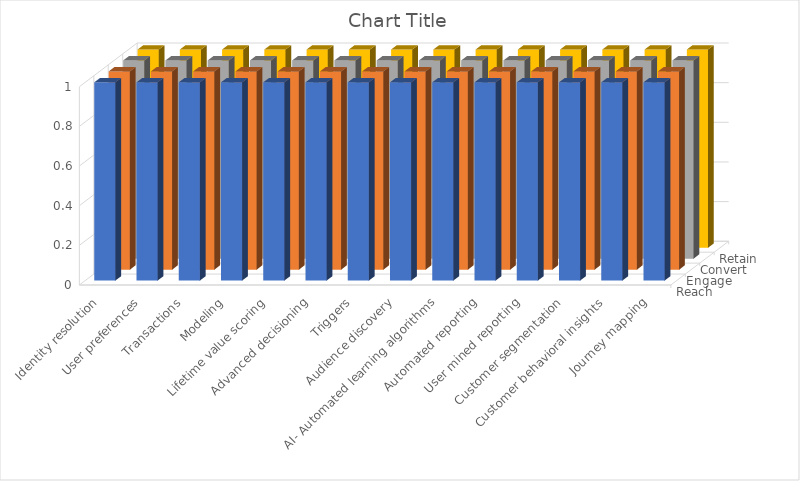
| Category | Reach | Engage | Convert | Retain |
|---|---|---|---|---|
| Identity resolution | 1 | 1 | 1 | 1 |
| User preferences | 1 | 1 | 1 | 1 |
| Transactions | 1 | 1 | 1 | 1 |
| Modeling | 1 | 1 | 1 | 1 |
| Lifetime value scoring | 1 | 1 | 1 | 1 |
| Advanced decisioning | 1 | 1 | 1 | 1 |
| Triggers | 1 | 1 | 1 | 1 |
| Audience discovery | 1 | 1 | 1 | 1 |
| AI- Automated learning algorithms | 1 | 1 | 1 | 1 |
| Automated reporting | 1 | 1 | 1 | 1 |
| User mined reporting | 1 | 1 | 1 | 1 |
| Customer segmentation | 1 | 1 | 1 | 1 |
| Customer behavioral insights | 1 | 1 | 1 | 1 |
| Journey mapping | 1 | 1 | 1 | 1 |